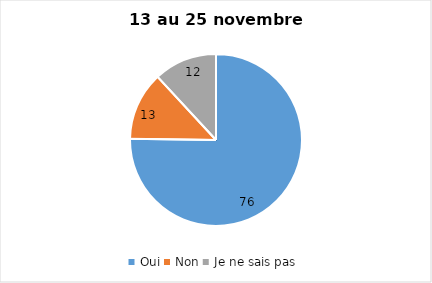
| Category | Series 0 |
|---|---|
| Oui | 76 |
| Non | 13 |
| Je ne sais pas | 12 |